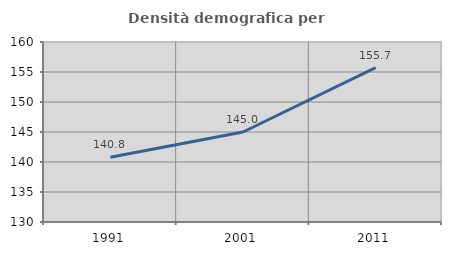
| Category | Densità demografica |
|---|---|
| 1991.0 | 140.775 |
| 2001.0 | 145.001 |
| 2011.0 | 155.723 |